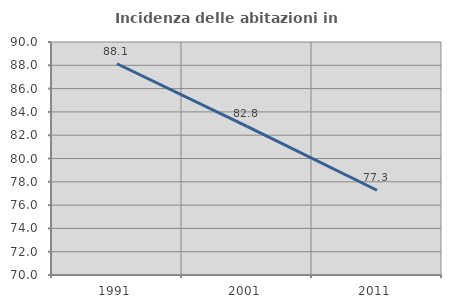
| Category | Incidenza delle abitazioni in proprietà  |
|---|---|
| 1991.0 | 88.131 |
| 2001.0 | 82.751 |
| 2011.0 | 77.273 |